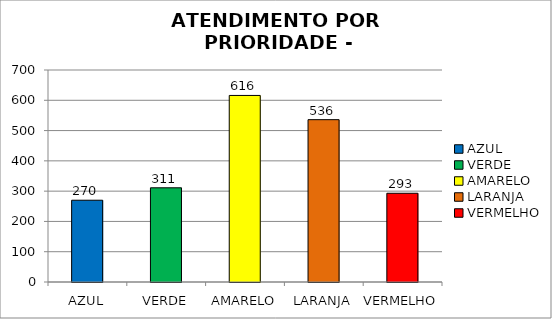
| Category | Total Regional: |
|---|---|
| AZUL | 270 |
| VERDE | 311 |
| AMARELO | 616 |
| LARANJA | 536 |
| VERMELHO | 293 |